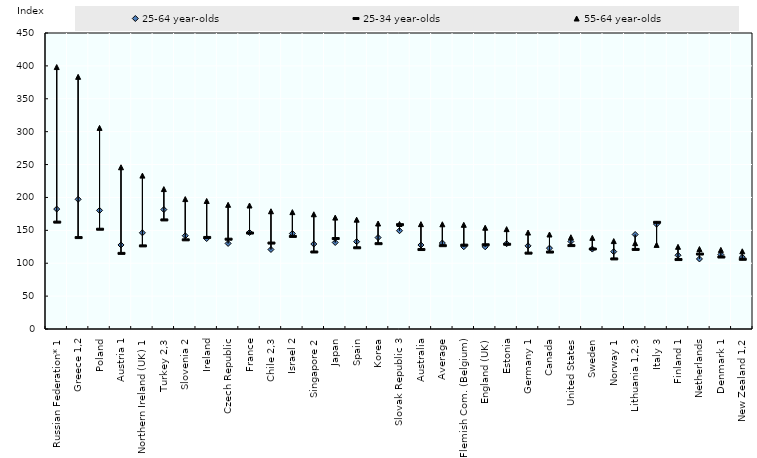
| Category | 25-64 year-olds | 25-34 year-olds | 55-64 year-olds |
|---|---|---|---|
| Russian Federation* 1 | 182.358 | 162.499 | 398.222 |
| Greece 1,2 | 197.15 | 138.978 | 383.334 |
| Poland | 180.341 | 151.693 | 305.76 |
| Austria 1 | 127.763 | 114.958 | 245.863 |
| Northern Ireland (UK) 1 | 146.218 | 126.354 | 233.181 |
| Turkey 2,3 | 181.556 | 165.834 | 212.698 |
| Slovenia 2 | 141.835 | 135.587 | 197.495 |
| Ireland | 137.535 | 139.178 | 194.625 |
| Czech Republic | 130.08 | 136.517 | 188.788 |
| France | 146.734 | 145.864 | 187.751 |
| Chile 2,3 | 120.866 | 130.651 | 179.004 |
| Israel 2 | 145.202 | 140.754 | 177.664 |
| Singapore 2 | 129.205 | 117.098 | 174.418 |
| Japan | 131.522 | 137.557 | 169.355 |
| Spain | 132.782 | 123.485 | 166.23 |
| Korea | 138.991 | 129.708 | 160.363 |
| Slovak Republic 3 | 149.393 | 158.625 | 159.617 |
| Australia | 127.676 | 120.797 | 159.423 |
| Average | 130.701 | 126.662 | 159.188 |
| Flemish Com. (Belgium) | 125.049 | 127.483 | 158.412 |
| England (UK) | 124.949 | 128.07 | 153.959 |
| Estonia | 129.652 | 128.829 | 151.814 |
| Germany 1 | 126.408 | 115.333 | 146.601 |
| Canada | 122.933 | 116.988 | 143.65 |
| United States | 133.06 | 126.806 | 139.457 |
| Sweden | 121.52 | 121.621 | 138.546 |
| Norway 1 | 117.619 | 106.556 | 133.619 |
| Lithuania 1,2,3 | 143.664 | 120.978 | 130.527 |
| Italy 3 | 159.354 | 162.158 | 127.851 |
| Finland 1 | 112.106 | 105.567 | 124.943 |
| Netherlands | 106.507 | 113.958 | 121.557 |
| Denmark 1 | 113.176 | 109.42 | 120.276 |
| New Zealand 1,2 | 109.199 | 105.984 | 118.148 |